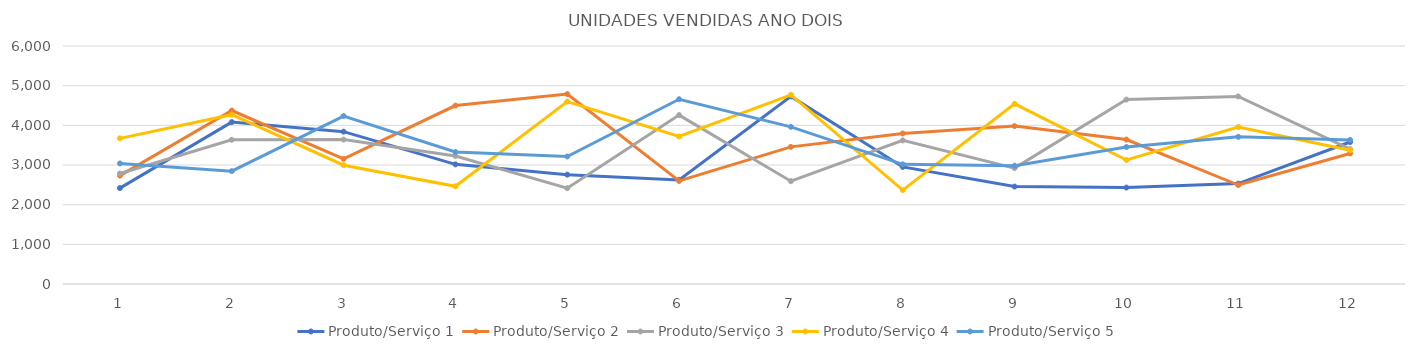
| Category | Produto/Serviço 1 | Produto/Serviço 2 | Produto/Serviço 3 | Produto/Serviço 4 | Produto/Serviço 5 |
|---|---|---|---|---|---|
| 0 | 2418 | 2732 | 2786 | 3672 | 3039 |
| 1 | 4081 | 4373 | 3636 | 4269 | 2845 |
| 2 | 3840 | 3155 | 3640 | 2995 | 4234 |
| 3 | 3016 | 4498 | 3226 | 2463 | 3327 |
| 4 | 2757 | 4788 | 2416 | 4599 | 3215 |
| 5 | 2625 | 2598 | 4258 | 3719 | 4658 |
| 6 | 4729 | 3457 | 2592 | 4768 | 3962 |
| 7 | 2952 | 3795 | 3620 | 2366 | 3017 |
| 8 | 2456 | 3981 | 2921 | 4542 | 2982 |
| 9 | 2431 | 3641 | 4649 | 3126 | 3454 |
| 10 | 2531 | 2495 | 4729 | 3958 | 3710 |
| 11 | 3580 | 3291 | 3400 | 3372 | 3632 |